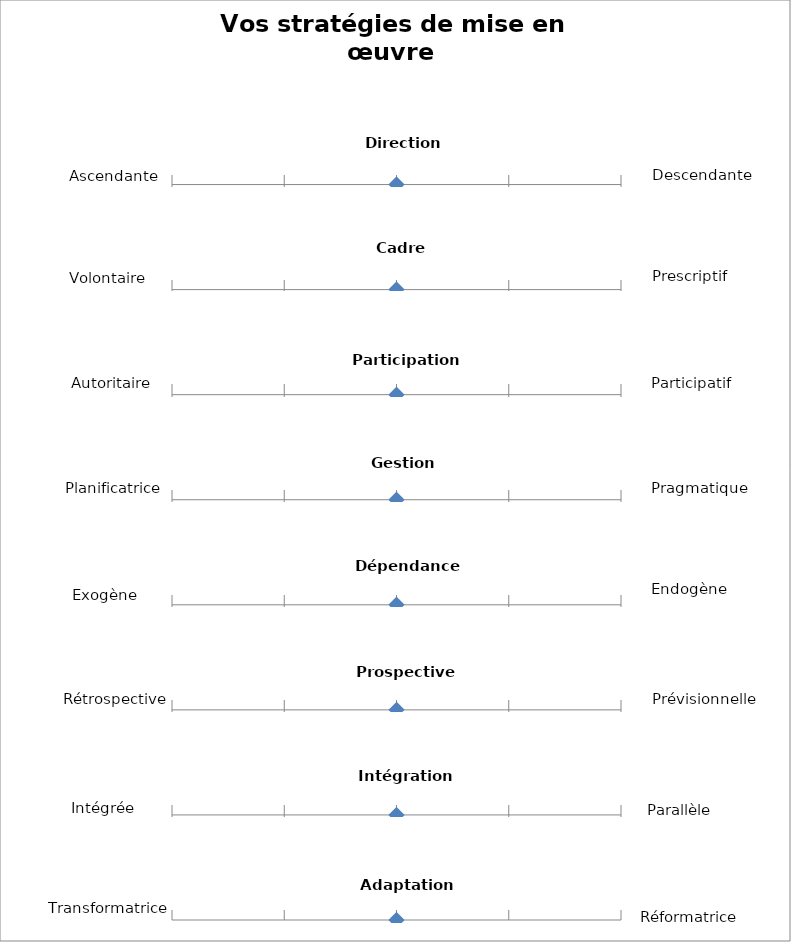
| Category | Series 0 |
|---|---|
| 0.5 | 8 |
| 0.5 | 7 |
| 0.5 | 6 |
| 0.5 | 5 |
| 0.5 | 4 |
| 0.5 | 3 |
| 0.5 | 2 |
| 0.5 | 1 |